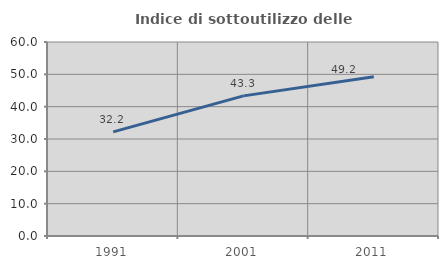
| Category | Indice di sottoutilizzo delle abitazioni  |
|---|---|
| 1991.0 | 32.19 |
| 2001.0 | 43.342 |
| 2011.0 | 49.222 |